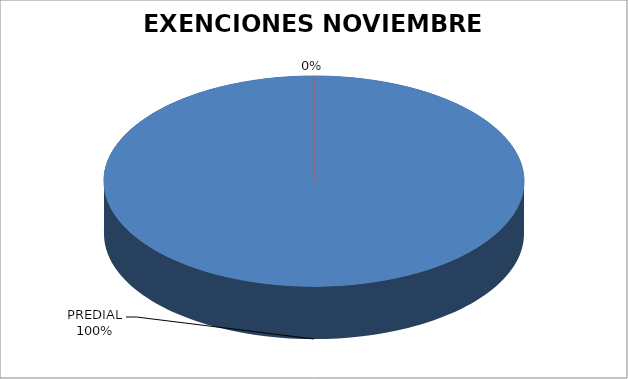
| Category | Series 0 |
|---|---|
| PREDIAL | 23 |